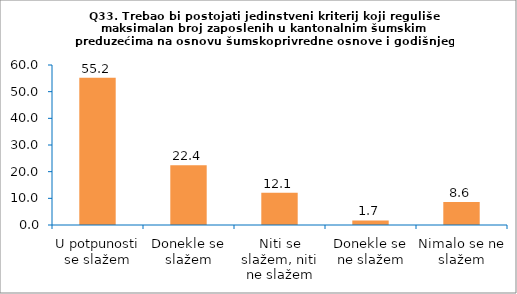
| Category | Series 0 |
|---|---|
| U potpunosti se slažem | 55.172 |
| Donekle se slažem | 22.414 |
| Niti se slažem, niti ne slažem | 12.069 |
| Donekle se ne slažem | 1.724 |
| Nimalo se ne slažem | 8.621 |